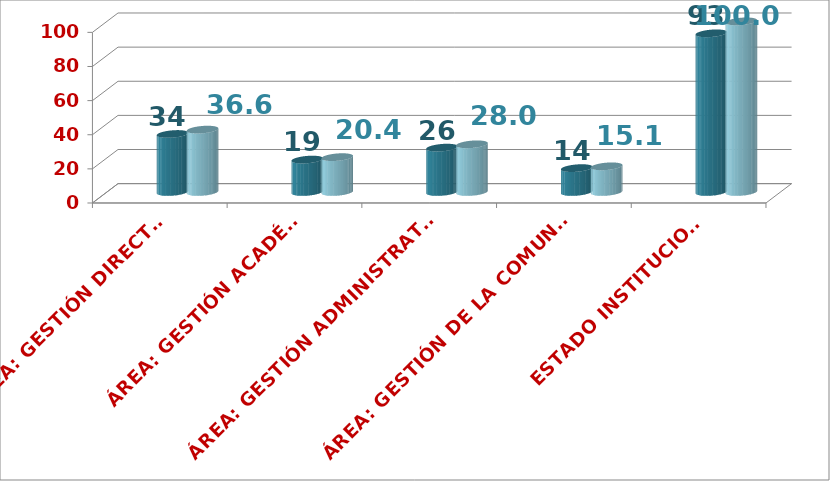
| Category | Series 0 | Series 1 | Series 2 |
|---|---|---|---|
| ÁREA: GESTIÓN DIRECTIVA |  | 34 | 36.559 |
| ÁREA: GESTIÓN ACADÉMICA |  | 19 | 20.43 |
| ÁREA: GESTIÓN ADMINISTRATIVA Y FINANCIERA |  | 26 | 27.957 |
| ÁREA: GESTIÓN DE LA COMUNIDAD |  | 14 | 15.054 |
| ESTADO INSTITUCIONAL |  | 93 | 100 |